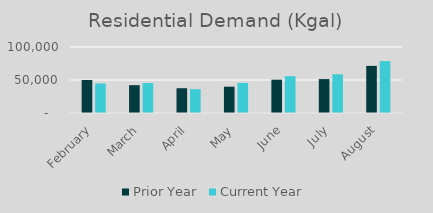
| Category | Prior Year | Current Year |
|---|---|---|
| February | 49996 | 44769 |
| March | 42168 | 45502 |
| April | 37537 | 36081 |
| May | 39883 | 45570 |
| June | 50498 | 55783 |
| July | 51383 | 58740 |
| August | 71400 | 78675 |